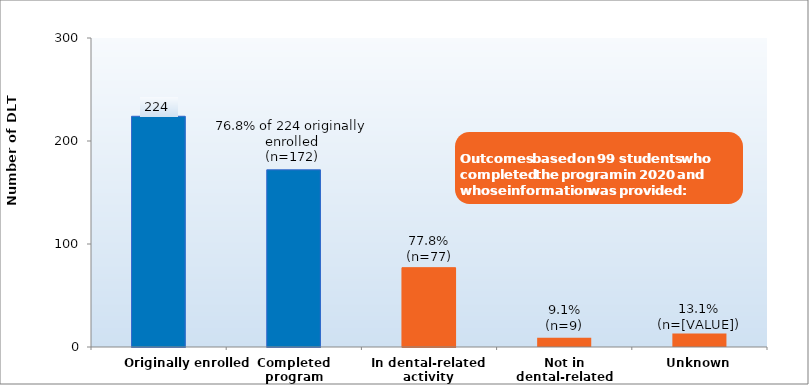
| Category | Series 0 |
|---|---|
| Originally enrolled | 224 |
| Completed program | 172 |
| In dental-related activity | 77 |
| Not in dental-related activity | 9 |
| Unknown | 13 |